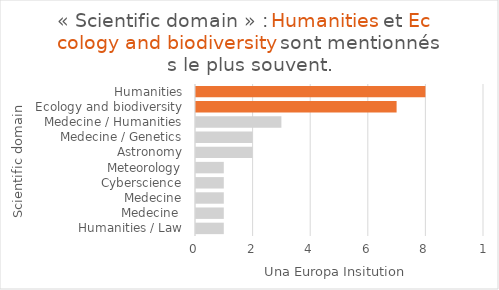
| Category | Total |
|---|---|
| Humanities | 8 |
| Ecology and biodiversity | 7 |
| Medecine / Humanities | 3 |
| Medecine / Genetics | 2 |
| Astronomy | 2 |
| Meteorology | 1 |
| Cyberscience | 1 |
| Medecine | 1 |
| Medecine  | 1 |
| Humanities / Law | 1 |